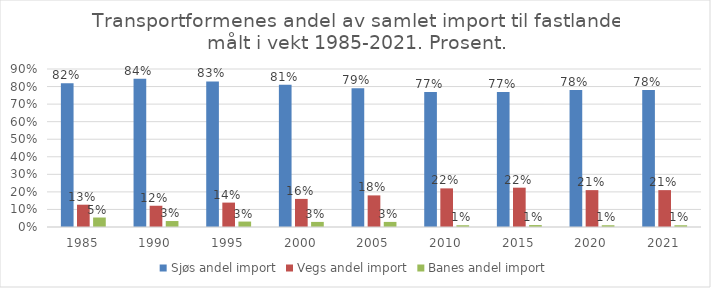
| Category | Sjøs andel import | Vegs andel import | Banes andel import |
|---|---|---|---|
| 1985.0 | 0.819 | 0.127 | 0.054 |
| 1990.0 | 0.844 | 0.121 | 0.034 |
| 1995.0 | 0.829 | 0.139 | 0.031 |
| 2000.0 | 0.81 | 0.16 | 0.029 |
| 2005.0 | 0.791 | 0.18 | 0.029 |
| 2010.0 | 0.769 | 0.22 | 0.01 |
| 2015.0 | 0.769 | 0.224 | 0.011 |
| 2020.0 | 0.78 | 0.21 | 0.01 |
| 2021.0 | 0.78 | 0.21 | 0.01 |